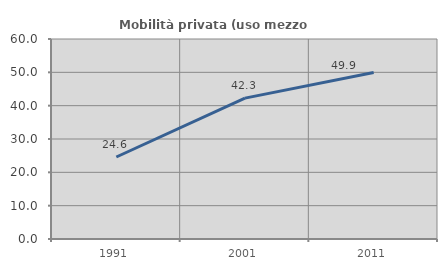
| Category | Mobilità privata (uso mezzo privato) |
|---|---|
| 1991.0 | 24.601 |
| 2001.0 | 42.264 |
| 2011.0 | 49.949 |